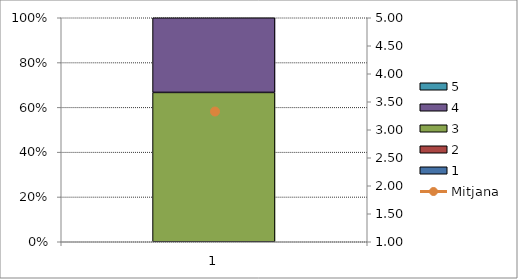
| Category | 1 | 2 | 3 | 4 | 5 |
|---|---|---|---|---|---|
| 0 | 0 | 0 | 8 | 4 | 0 |